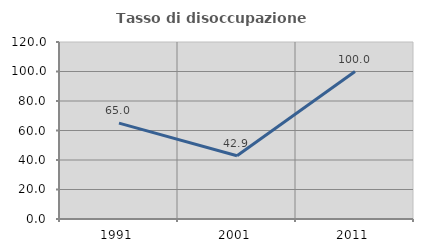
| Category | Tasso di disoccupazione giovanile  |
|---|---|
| 1991.0 | 65 |
| 2001.0 | 42.857 |
| 2011.0 | 100 |